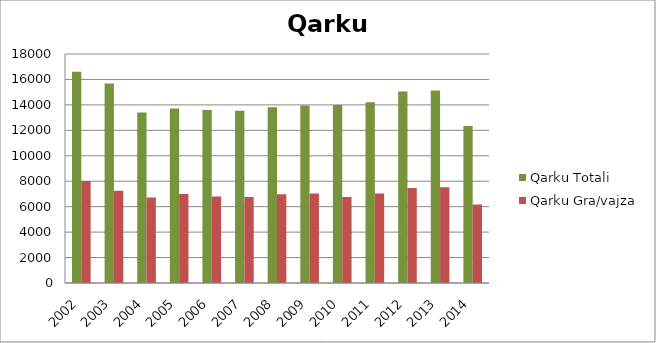
| Category | Qarku Totali | Qarku Gra/vajza |
|---|---|---|
| 2002.0 | 16605 | 8019 |
| 2003.0 | 15685 | 7256 |
| 2004.0 | 13399 | 6715 |
| 2005.0 | 13707 | 7005 |
| 2006.0 | 13608 | 6807 |
| 2007.0 | 13541 | 6760 |
| 2008.0 | 13817 | 6968 |
| 2009.0 | 13950 | 7031 |
| 2010.0 | 13995 | 6766 |
| 2011.0 | 14207 | 7044 |
| 2012.0 | 15054 | 7471 |
| 2013.0 | 15130 | 7534 |
| 2014.0 | 12340 | 6170 |